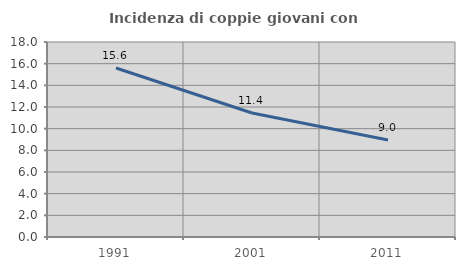
| Category | Incidenza di coppie giovani con figli |
|---|---|
| 1991.0 | 15.596 |
| 2001.0 | 11.448 |
| 2011.0 | 8.95 |